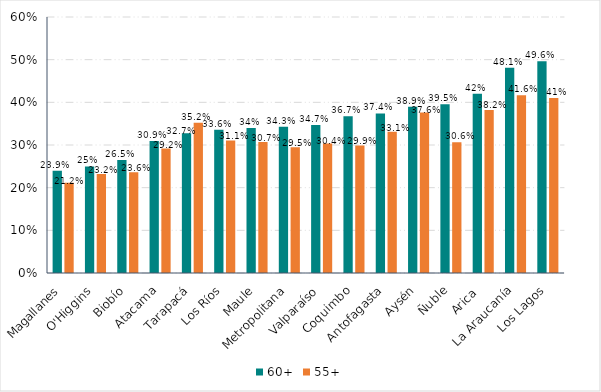
| Category | 60+ | 55+ |
|---|---|---|
| Magallanes | 0.239 | 0.212 |
| O'Higgins | 0.25 | 0.232 |
| Biobío | 0.265 | 0.236 |
| Atacama | 0.309 | 0.292 |
| Tarapacá | 0.327 | 0.352 |
| Los Ríos | 0.336 | 0.311 |
| Maule | 0.34 | 0.307 |
| Metropolitana | 0.343 | 0.295 |
| Valparaíso | 0.347 | 0.304 |
| Coquimbo | 0.367 | 0.299 |
| Antofagasta | 0.374 | 0.331 |
| Aysén | 0.389 | 0.376 |
| Ñuble | 0.395 | 0.306 |
| Arica  | 0.42 | 0.382 |
| La Araucanía | 0.481 | 0.416 |
| Los Lagos | 0.496 | 0.41 |